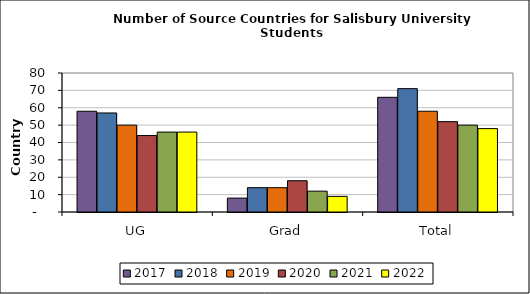
| Category | 2017 | 2018 | 2019 | 2020 | 2021 | 2022 |
|---|---|---|---|---|---|---|
| UG | 58 | 57 | 50 | 44 | 46 | 46 |
| Grad | 8 | 14 | 14 | 18 | 12 | 9 |
| Total | 66 | 71 | 58 | 52 | 50 | 48 |